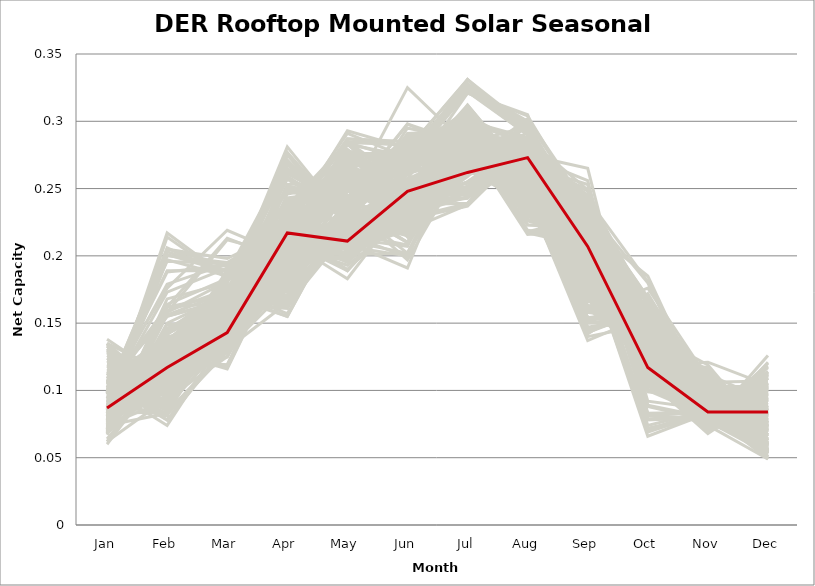
| Category | sample_001 | sample_002 | sample_003 | sample_004 | sample_005 | sample_006 | sample_007 | sample_008 | sample_009 | sample_010 | sample_011 | sample_012 | sample_013 | sample_014 | sample_015 | sample_016 | sample_017 | sample_018 | sample_019 | sample_020 | sample_021 | sample_022 | sample_023 | sample_024 | sample_025 | sample_026 | sample_027 | sample_028 | sample_029 | sample_030 | sample_031 | sample_032 | sample_033 | sample_034 | sample_035 | sample_036 | sample_037 | sample_038 | sample_039 | sample_040 | sample_041 | sample_042 | sample_043 | sample_044 | sample_045 | sample_046 | sample_047 | sample_048 | sample_049 | sample_050 | sample_051 | sample_052 | sample_053 | sample_054 | sample_055 | sample_056 | sample_057 | sample_058 | sample_059 | sample_060 | sample_061 | sample_062 | sample_063 | sample_064 | sample_065 | sample_066 | sample_067 | sample_068 | sample_069 | sample_070 | sample_071 | sample_072 | sample_073 | sample_074 | sample_075 | sample_076 | sample_077 | sample_078 | sample_079 | sample_080 | sample_081 | sample_082 | sample_083 | sample_084 | sample_085 | sample_086 | sample_087 | sample_088 | sample_089 | sample_090 | sample_091 | sample_092 | sample_093 | sample_094 | sample_095 | sample_096 | sample_097 | sample_098 | sample_099 | sample_100 | sample_101 | sample_102 | sample_103 | sample_104 | sample_105 | sample_106 | sample_107 | sample_108 | sample_109 | sample_110 | sample_111 | sample_112 | sample_113 | sample_114 | sample_115 | sample_116 | sample_117 | sample_118 | sample_119 | sample_120 | sample_121 | sample_122 | sample_123 | sample_124 | sample_125 | sample_126 | sample_127 | sample_128 | sample_129 | sample_130 | sample_131 | sample_132 | sample_133 | sample_134 | sample_135 | sample_136 | sample_137 | sample_138 | sample_139 | sample_140 | sample_141 | sample_142 | sample_143 | sample_144 | sample_145 | sample_146 | sample_147 | sample_148 | sample_149 | sample_150 | sample_151 | sample_152 | sample_153 | sample_154 | sample_155 | sample_156 | sample_157 | sample_158 | sample_159 | sample_160 | sample_161 | sample_162 | sample_163 | sample_164 | sample_165 | sample_166 | sample_167 | sample_168 | sample_169 | sample_170 | sample_171 | sample_172 | sample_173 | sample_174 | sample_175 | sample_176 | sample_178 | sample_179 | sample_180 | sample_181 | sample_182 | sample_183 | sample_184 | sample_185 | sample_186 | sample_187 | sample_188 | sample_189 | sample_190 | sample_191 | sample_192 | sample_193 | sample_194 | sample_195 | sample_196 | sample_197 | sample_198 | sample_199 | sample_200 | sample_201 | sample_202 | sample_203 | sample_204 | sample_205 | sample_206 | sample_207 | sample_208 | sample_209 | sample_210 | sample_211 | sample_212 | sample_213 | sample_214 | sample_215 | sample_216 | sample_217 | sample_218 | sample_219 | sample_220 | sample_221 | sample_222 | sample_223 | sample_224 | sample_225 | sample_226 | sample_227 | sample_228 | sample_229 | sample_230 | sample_231 | sample_232 | sample_233 | sample_234 | sample_235 | sample_236 | sample_237 | sample_238 | sample_239 | sample_240 | sample_241 | sample_242 | sample_243 | sample_244 | sample_245 | sample_246 | sample_247 | sample_248 | sample_249 | sample_250 | sample_177 |
|---|---|---|---|---|---|---|---|---|---|---|---|---|---|---|---|---|---|---|---|---|---|---|---|---|---|---|---|---|---|---|---|---|---|---|---|---|---|---|---|---|---|---|---|---|---|---|---|---|---|---|---|---|---|---|---|---|---|---|---|---|---|---|---|---|---|---|---|---|---|---|---|---|---|---|---|---|---|---|---|---|---|---|---|---|---|---|---|---|---|---|---|---|---|---|---|---|---|---|---|---|---|---|---|---|---|---|---|---|---|---|---|---|---|---|---|---|---|---|---|---|---|---|---|---|---|---|---|---|---|---|---|---|---|---|---|---|---|---|---|---|---|---|---|---|---|---|---|---|---|---|---|---|---|---|---|---|---|---|---|---|---|---|---|---|---|---|---|---|---|---|---|---|---|---|---|---|---|---|---|---|---|---|---|---|---|---|---|---|---|---|---|---|---|---|---|---|---|---|---|---|---|---|---|---|---|---|---|---|---|---|---|---|---|---|---|---|---|---|---|---|---|---|---|---|---|---|---|---|---|---|---|---|---|---|---|---|---|---|---|---|---|---|---|---|---|---|---|---|---|---|
| Jan | 0.106 | 0.072 | 0.075 | 0.102 | 0.108 | 0.084 | 0.083 | 0.131 | 0.114 | 0.105 | 0.073 | 0.082 | 0.099 | 0.076 | 0.122 | 0.085 | 0.104 | 0.109 | 0.122 | 0.072 | 0.083 | 0.085 | 0.085 | 0.105 | 0.104 | 0.094 | 0.091 | 0.115 | 0.085 | 0.075 | 0.085 | 0.079 | 0.096 | 0.083 | 0.076 | 0.078 | 0.077 | 0.087 | 0.099 | 0.138 | 0.09 | 0.118 | 0.105 | 0.078 | 0.068 | 0.086 | 0.124 | 0.134 | 0.109 | 0.089 | 0.084 | 0.083 | 0.092 | 0.113 | 0.098 | 0.135 | 0.128 | 0.073 | 0.113 | 0.074 | 0.105 | 0.098 | 0.079 | 0.067 | 0.091 | 0.078 | 0.101 | 0.085 | 0.099 | 0.111 | 0.087 | 0.086 | 0.095 | 0.107 | 0.084 | 0.069 | 0.107 | 0.11 | 0.113 | 0.082 | 0.115 | 0.108 | 0.098 | 0.133 | 0.093 | 0.119 | 0.113 | 0.105 | 0.085 | 0.086 | 0.091 | 0.078 | 0.084 | 0.083 | 0.112 | 0.069 | 0.119 | 0.109 | 0.119 | 0.078 | 0.108 | 0.064 | 0.07 | 0.081 | 0.095 | 0.09 | 0.088 | 0.079 | 0.089 | 0.131 | 0.097 | 0.118 | 0.129 | 0.135 | 0.103 | 0.087 | 0.073 | 0.088 | 0.084 | 0.077 | 0.071 | 0.083 | 0.081 | 0.069 | 0.081 | 0.083 | 0.111 | 0.082 | 0.086 | 0.085 | 0.126 | 0.107 | 0.068 | 0.106 | 0.095 | 0.062 | 0.079 | 0.074 | 0.087 | 0.089 | 0.079 | 0.101 | 0.092 | 0.13 | 0.097 | 0.091 | 0.094 | 0.084 | 0.071 | 0.099 | 0.087 | 0.078 | 0.07 | 0.097 | 0.112 | 0.06 | 0.118 | 0.12 | 0.092 | 0.08 | 0.099 | 0.135 | 0.098 | 0.111 | 0.096 | 0.089 | 0.095 | 0.084 | 0.086 | 0.114 | 0.105 | 0.08 | 0.082 | 0.086 | 0.079 | 0.109 | 0.074 | 0.084 | 0.087 | 0.082 | 0.092 | 0.078 | 0.077 | 0.101 | 0.088 | 0.088 | 0.108 | 0.092 | 0.101 | 0.108 | 0.102 | 0.072 | 0.083 | 0.098 | 0.083 | 0.088 | 0.079 | 0.1 | 0.098 | 0.093 | 0.102 | 0.096 | 0.082 | 0.086 | 0.112 | 0.081 | 0.1 | 0.106 | 0.116 | 0.105 | 0.08 | 0.106 | 0.089 | 0.088 | 0.102 | 0.087 | 0.106 | 0.094 | 0.101 | 0.077 | 0.109 | 0.099 | 0.094 | 0.104 | 0.112 | 0.077 | 0.091 | 0.107 | 0.106 | 0.062 | 0.111 | 0.106 | 0.068 | 0.088 | 0.108 | 0.093 | 0.111 | 0.09 | 0.124 | 0.133 | 0.077 | 0.083 | 0.081 | 0.111 | 0.093 | 0.114 | 0.091 | 0.077 | 0.071 | 0.087 |
| Feb | 0.121 | 0.115 | 0.159 | 0.114 | 0.117 | 0.108 | 0.121 | 0.101 | 0.086 | 0.102 | 0.135 | 0.116 | 0.113 | 0.164 | 0.106 | 0.137 | 0.078 | 0.131 | 0.106 | 0.143 | 0.106 | 0.118 | 0.146 | 0.129 | 0.127 | 0.173 | 0.11 | 0.106 | 0.142 | 0.142 | 0.106 | 0.095 | 0.123 | 0.124 | 0.114 | 0.121 | 0.13 | 0.135 | 0.162 | 0.108 | 0.122 | 0.108 | 0.115 | 0.206 | 0.156 | 0.116 | 0.098 | 0.097 | 0.131 | 0.109 | 0.122 | 0.112 | 0.089 | 0.111 | 0.189 | 0.097 | 0.094 | 0.135 | 0.098 | 0.093 | 0.155 | 0.2 | 0.127 | 0.146 | 0.081 | 0.127 | 0.087 | 0.203 | 0.205 | 0.117 | 0.122 | 0.099 | 0.119 | 0.139 | 0.108 | 0.142 | 0.128 | 0.106 | 0.09 | 0.104 | 0.116 | 0.109 | 0.118 | 0.096 | 0.09 | 0.102 | 0.118 | 0.11 | 0.104 | 0.108 | 0.112 | 0.121 | 0.128 | 0.133 | 0.107 | 0.138 | 0.108 | 0.126 | 0.122 | 0.115 | 0.092 | 0.118 | 0.15 | 0.101 | 0.108 | 0.111 | 0.125 | 0.118 | 0.134 | 0.098 | 0.094 | 0.103 | 0.106 | 0.094 | 0.12 | 0.099 | 0.1 | 0.117 | 0.101 | 0.123 | 0.144 | 0.123 | 0.214 | 0.112 | 0.131 | 0.131 | 0.124 | 0.118 | 0.126 | 0.104 | 0.103 | 0.127 | 0.108 | 0.123 | 0.118 | 0.094 | 0.123 | 0.083 | 0.108 | 0.122 | 0.117 | 0.158 | 0.124 | 0.088 | 0.117 | 0.119 | 0.122 | 0.114 | 0.168 | 0.112 | 0.142 | 0.129 | 0.162 | 0.179 | 0.121 | 0.119 | 0.117 | 0.115 | 0.123 | 0.127 | 0.196 | 0.113 | 0.118 | 0.133 | 0.093 | 0.144 | 0.094 | 0.144 | 0.122 | 0.113 | 0.134 | 0.107 | 0.101 | 0.092 | 0.099 | 0.14 | 0.143 | 0.106 | 0.116 | 0.128 | 0.102 | 0.115 | 0.118 | 0.12 | 0.115 | 0.099 | 0.123 | 0.127 | 0.083 | 0.082 | 0.074 | 0.135 | 0.084 | 0.188 | 0.134 | 0.201 | 0.132 | 0.106 | 0.11 | 0.097 | 0.162 | 0.092 | 0.107 | 0.217 | 0.119 | 0.109 | 0.134 | 0.122 | 0.096 | 0.115 | 0.12 | 0.085 | 0.107 | 0.12 | 0.176 | 0.095 | 0.155 | 0.119 | 0.082 | 0.158 | 0.138 | 0.205 | 0.129 | 0.137 | 0.117 | 0.125 | 0.112 | 0.115 | 0.085 | 0.124 | 0.113 | 0.123 | 0.149 | 0.11 | 0.078 | 0.115 | 0.12 | 0.098 | 0.104 | 0.097 | 0.123 | 0.197 | 0.106 | 0.131 | 0.121 | 0.115 | 0.118 | 0.115 | 0.142 | 0.117 |
| Mar | 0.153 | 0.187 | 0.175 | 0.158 | 0.169 | 0.146 | 0.171 | 0.13 | 0.157 | 0.143 | 0.171 | 0.171 | 0.156 | 0.183 | 0.134 | 0.175 | 0.133 | 0.166 | 0.135 | 0.166 | 0.169 | 0.171 | 0.17 | 0.116 | 0.117 | 0.191 | 0.148 | 0.156 | 0.165 | 0.174 | 0.149 | 0.151 | 0.189 | 0.154 | 0.185 | 0.171 | 0.172 | 0.163 | 0.213 | 0.156 | 0.144 | 0.153 | 0.151 | 0.185 | 0.173 | 0.168 | 0.134 | 0.148 | 0.145 | 0.173 | 0.175 | 0.17 | 0.155 | 0.172 | 0.189 | 0.148 | 0.152 | 0.16 | 0.15 | 0.142 | 0.168 | 0.195 | 0.174 | 0.149 | 0.182 | 0.149 | 0.15 | 0.189 | 0.198 | 0.172 | 0.152 | 0.182 | 0.143 | 0.151 | 0.162 | 0.17 | 0.145 | 0.148 | 0.162 | 0.147 | 0.119 | 0.156 | 0.166 | 0.133 | 0.151 | 0.151 | 0.14 | 0.163 | 0.155 | 0.142 | 0.137 | 0.176 | 0.174 | 0.176 | 0.164 | 0.152 | 0.128 | 0.145 | 0.167 | 0.168 | 0.149 | 0.132 | 0.171 | 0.142 | 0.152 | 0.152 | 0.162 | 0.185 | 0.178 | 0.148 | 0.169 | 0.134 | 0.148 | 0.136 | 0.161 | 0.161 | 0.138 | 0.144 | 0.14 | 0.149 | 0.177 | 0.171 | 0.183 | 0.187 | 0.174 | 0.173 | 0.153 | 0.168 | 0.151 | 0.16 | 0.138 | 0.14 | 0.13 | 0.125 | 0.147 | 0.125 | 0.171 | 0.131 | 0.15 | 0.167 | 0.181 | 0.212 | 0.141 | 0.137 | 0.158 | 0.162 | 0.143 | 0.155 | 0.18 | 0.17 | 0.169 | 0.17 | 0.171 | 0.194 | 0.125 | 0.133 | 0.174 | 0.15 | 0.143 | 0.14 | 0.194 | 0.155 | 0.153 | 0.171 | 0.149 | 0.165 | 0.152 | 0.169 | 0.166 | 0.136 | 0.146 | 0.167 | 0.167 | 0.149 | 0.156 | 0.148 | 0.169 | 0.169 | 0.165 | 0.17 | 0.156 | 0.182 | 0.151 | 0.171 | 0.145 | 0.157 | 0.161 | 0.142 | 0.154 | 0.129 | 0.142 | 0.162 | 0.131 | 0.193 | 0.171 | 0.188 | 0.175 | 0.172 | 0.162 | 0.152 | 0.165 | 0.146 | 0.143 | 0.184 | 0.151 | 0.154 | 0.162 | 0.119 | 0.158 | 0.159 | 0.183 | 0.155 | 0.166 | 0.14 | 0.219 | 0.15 | 0.167 | 0.175 | 0.169 | 0.181 | 0.166 | 0.193 | 0.139 | 0.167 | 0.156 | 0.149 | 0.14 | 0.175 | 0.158 | 0.135 | 0.149 | 0.146 | 0.149 | 0.147 | 0.134 | 0.144 | 0.167 | 0.15 | 0.138 | 0.138 | 0.156 | 0.185 | 0.138 | 0.151 | 0.164 | 0.133 | 0.146 | 0.181 | 0.175 | 0.143 |
| Apr | 0.237 | 0.27 | 0.238 | 0.232 | 0.216 | 0.222 | 0.163 | 0.209 | 0.187 | 0.175 | 0.223 | 0.176 | 0.235 | 0.249 | 0.211 | 0.183 | 0.185 | 0.221 | 0.204 | 0.214 | 0.257 | 0.162 | 0.188 | 0.208 | 0.208 | 0.218 | 0.192 | 0.202 | 0.184 | 0.224 | 0.253 | 0.215 | 0.202 | 0.213 | 0.262 | 0.181 | 0.178 | 0.184 | 0.196 | 0.204 | 0.189 | 0.218 | 0.237 | 0.224 | 0.243 | 0.163 | 0.207 | 0.207 | 0.184 | 0.281 | 0.164 | 0.168 | 0.218 | 0.203 | 0.224 | 0.214 | 0.213 | 0.216 | 0.212 | 0.209 | 0.231 | 0.222 | 0.169 | 0.202 | 0.199 | 0.195 | 0.171 | 0.231 | 0.22 | 0.202 | 0.22 | 0.23 | 0.188 | 0.183 | 0.275 | 0.233 | 0.179 | 0.223 | 0.197 | 0.246 | 0.21 | 0.204 | 0.224 | 0.21 | 0.218 | 0.206 | 0.177 | 0.226 | 0.211 | 0.219 | 0.192 | 0.177 | 0.186 | 0.173 | 0.215 | 0.208 | 0.197 | 0.187 | 0.22 | 0.271 | 0.174 | 0.184 | 0.228 | 0.217 | 0.188 | 0.186 | 0.162 | 0.268 | 0.201 | 0.211 | 0.186 | 0.202 | 0.21 | 0.208 | 0.225 | 0.258 | 0.211 | 0.183 | 0.224 | 0.203 | 0.223 | 0.265 | 0.225 | 0.262 | 0.185 | 0.18 | 0.219 | 0.277 | 0.216 | 0.219 | 0.205 | 0.189 | 0.192 | 0.213 | 0.193 | 0.2 | 0.166 | 0.176 | 0.229 | 0.216 | 0.261 | 0.2 | 0.194 | 0.206 | 0.234 | 0.197 | 0.208 | 0.202 | 0.25 | 0.155 | 0.186 | 0.171 | 0.251 | 0.212 | 0.205 | 0.19 | 0.242 | 0.214 | 0.206 | 0.228 | 0.214 | 0.196 | 0.234 | 0.204 | 0.22 | 0.184 | 0.224 | 0.177 | 0.182 | 0.198 | 0.185 | 0.271 | 0.259 | 0.223 | 0.23 | 0.193 | 0.24 | 0.268 | 0.27 | 0.169 | 0.264 | 0.268 | 0.201 | 0.239 | 0.192 | 0.217 | 0.22 | 0.195 | 0.218 | 0.183 | 0.191 | 0.221 | 0.165 | 0.226 | 0.17 | 0.221 | 0.186 | 0.155 | 0.225 | 0.261 | 0.229 | 0.221 | 0.219 | 0.23 | 0.216 | 0.205 | 0.224 | 0.208 | 0.189 | 0.233 | 0.268 | 0.189 | 0.252 | 0.197 | 0.2 | 0.207 | 0.228 | 0.157 | 0.188 | 0.248 | 0.211 | 0.218 | 0.189 | 0.211 | 0.213 | 0.198 | 0.218 | 0.21 | 0.194 | 0.183 | 0.181 | 0.177 | 0.213 | 0.183 | 0.187 | 0.192 | 0.208 | 0.252 | 0.214 | 0.211 | 0.206 | 0.226 | 0.222 | 0.19 | 0.161 | 0.201 | 0.198 | 0.263 | 0.227 | 0.217 |
| May | 0.225 | 0.232 | 0.243 | 0.283 | 0.19 | 0.219 | 0.218 | 0.277 | 0.21 | 0.235 | 0.261 | 0.217 | 0.276 | 0.24 | 0.269 | 0.218 | 0.25 | 0.293 | 0.262 | 0.251 | 0.229 | 0.227 | 0.223 | 0.258 | 0.251 | 0.213 | 0.229 | 0.201 | 0.222 | 0.256 | 0.255 | 0.262 | 0.245 | 0.26 | 0.235 | 0.222 | 0.224 | 0.229 | 0.2 | 0.274 | 0.225 | 0.206 | 0.284 | 0.219 | 0.249 | 0.231 | 0.263 | 0.285 | 0.239 | 0.226 | 0.226 | 0.23 | 0.259 | 0.202 | 0.204 | 0.277 | 0.283 | 0.267 | 0.213 | 0.255 | 0.262 | 0.21 | 0.226 | 0.278 | 0.224 | 0.252 | 0.222 | 0.21 | 0.212 | 0.197 | 0.273 | 0.207 | 0.23 | 0.248 | 0.223 | 0.258 | 0.233 | 0.204 | 0.216 | 0.254 | 0.252 | 0.217 | 0.278 | 0.274 | 0.261 | 0.211 | 0.235 | 0.291 | 0.256 | 0.259 | 0.223 | 0.217 | 0.222 | 0.222 | 0.195 | 0.269 | 0.259 | 0.255 | 0.189 | 0.222 | 0.233 | 0.238 | 0.251 | 0.26 | 0.222 | 0.22 | 0.24 | 0.242 | 0.248 | 0.279 | 0.231 | 0.271 | 0.274 | 0.283 | 0.287 | 0.235 | 0.25 | 0.226 | 0.264 | 0.252 | 0.256 | 0.232 | 0.206 | 0.235 | 0.226 | 0.221 | 0.206 | 0.226 | 0.272 | 0.267 | 0.263 | 0.237 | 0.236 | 0.25 | 0.229 | 0.231 | 0.221 | 0.236 | 0.254 | 0.271 | 0.238 | 0.198 | 0.224 | 0.269 | 0.27 | 0.257 | 0.224 | 0.261 | 0.234 | 0.237 | 0.225 | 0.214 | 0.241 | 0.215 | 0.256 | 0.239 | 0.241 | 0.209 | 0.223 | 0.227 | 0.211 | 0.277 | 0.267 | 0.198 | 0.266 | 0.227 | 0.261 | 0.231 | 0.23 | 0.262 | 0.248 | 0.229 | 0.231 | 0.262 | 0.241 | 0.258 | 0.243 | 0.229 | 0.224 | 0.227 | 0.234 | 0.238 | 0.257 | 0.252 | 0.216 | 0.264 | 0.287 | 0.226 | 0.253 | 0.25 | 0.239 | 0.26 | 0.228 | 0.212 | 0.22 | 0.205 | 0.216 | 0.237 | 0.238 | 0.239 | 0.255 | 0.264 | 0.224 | 0.204 | 0.202 | 0.258 | 0.285 | 0.253 | 0.207 | 0.284 | 0.231 | 0.239 | 0.23 | 0.22 | 0.207 | 0.258 | 0.257 | 0.235 | 0.234 | 0.238 | 0.183 | 0.209 | 0.224 | 0.189 | 0.201 | 0.248 | 0.213 | 0.2 | 0.232 | 0.237 | 0.24 | 0.234 | 0.274 | 0.216 | 0.24 | 0.225 | 0.193 | 0.243 | 0.278 | 0.279 | 0.254 | 0.21 | 0.262 | 0.266 | 0.236 | 0.258 | 0.218 | 0.235 | 0.254 | 0.211 |
| Jun | 0.255 | 0.275 | 0.288 | 0.274 | 0.232 | 0.24 | 0.23 | 0.253 | 0.191 | 0.267 | 0.263 | 0.225 | 0.276 | 0.287 | 0.242 | 0.233 | 0.232 | 0.28 | 0.252 | 0.269 | 0.28 | 0.218 | 0.249 | 0.248 | 0.256 | 0.222 | 0.243 | 0.202 | 0.24 | 0.282 | 0.252 | 0.218 | 0.253 | 0.278 | 0.271 | 0.227 | 0.24 | 0.244 | 0.236 | 0.275 | 0.239 | 0.22 | 0.271 | 0.249 | 0.289 | 0.227 | 0.244 | 0.253 | 0.279 | 0.282 | 0.215 | 0.228 | 0.229 | 0.231 | 0.23 | 0.257 | 0.242 | 0.238 | 0.207 | 0.217 | 0.263 | 0.243 | 0.242 | 0.226 | 0.246 | 0.277 | 0.257 | 0.248 | 0.232 | 0.233 | 0.28 | 0.264 | 0.239 | 0.268 | 0.282 | 0.278 | 0.27 | 0.219 | 0.199 | 0.252 | 0.257 | 0.208 | 0.269 | 0.248 | 0.229 | 0.202 | 0.273 | 0.273 | 0.266 | 0.224 | 0.23 | 0.224 | 0.232 | 0.24 | 0.235 | 0.229 | 0.252 | 0.273 | 0.239 | 0.288 | 0.269 | 0.277 | 0.285 | 0.214 | 0.227 | 0.238 | 0.21 | 0.276 | 0.242 | 0.24 | 0.224 | 0.251 | 0.261 | 0.255 | 0.285 | 0.282 | 0.223 | 0.239 | 0.219 | 0.279 | 0.286 | 0.28 | 0.24 | 0.277 | 0.234 | 0.235 | 0.233 | 0.295 | 0.28 | 0.267 | 0.242 | 0.279 | 0.27 | 0.248 | 0.247 | 0.277 | 0.229 | 0.285 | 0.257 | 0.251 | 0.276 | 0.229 | 0.231 | 0.234 | 0.278 | 0.274 | 0.232 | 0.273 | 0.283 | 0.202 | 0.237 | 0.23 | 0.298 | 0.225 | 0.251 | 0.276 | 0.325 | 0.222 | 0.238 | 0.256 | 0.237 | 0.269 | 0.278 | 0.239 | 0.228 | 0.245 | 0.222 | 0.236 | 0.228 | 0.243 | 0.277 | 0.291 | 0.276 | 0.222 | 0.256 | 0.278 | 0.298 | 0.275 | 0.29 | 0.242 | 0.268 | 0.275 | 0.281 | 0.264 | 0.23 | 0.224 | 0.282 | 0.242 | 0.239 | 0.24 | 0.231 | 0.261 | 0.268 | 0.233 | 0.241 | 0.245 | 0.237 | 0.197 | 0.279 | 0.275 | 0.251 | 0.222 | 0.244 | 0.262 | 0.222 | 0.269 | 0.282 | 0.235 | 0.2 | 0.283 | 0.283 | 0.23 | 0.282 | 0.235 | 0.227 | 0.217 | 0.252 | 0.21 | 0.234 | 0.28 | 0.241 | 0.233 | 0.233 | 0.237 | 0.239 | 0.28 | 0.249 | 0.241 | 0.229 | 0.266 | 0.272 | 0.27 | 0.242 | 0.235 | 0.225 | 0.228 | 0.228 | 0.26 | 0.254 | 0.248 | 0.278 | 0.244 | 0.22 | 0.274 | 0.21 | 0.261 | 0.219 | 0.267 | 0.273 | 0.248 |
| Jul | 0.273 | 0.281 | 0.28 | 0.285 | 0.281 | 0.248 | 0.284 | 0.284 | 0.3 | 0.323 | 0.285 | 0.276 | 0.297 | 0.291 | 0.273 | 0.298 | 0.287 | 0.285 | 0.286 | 0.291 | 0.289 | 0.289 | 0.302 | 0.276 | 0.278 | 0.274 | 0.243 | 0.284 | 0.293 | 0.277 | 0.291 | 0.27 | 0.27 | 0.308 | 0.29 | 0.276 | 0.294 | 0.297 | 0.262 | 0.272 | 0.248 | 0.284 | 0.287 | 0.309 | 0.275 | 0.29 | 0.277 | 0.283 | 0.331 | 0.289 | 0.283 | 0.287 | 0.274 | 0.269 | 0.301 | 0.271 | 0.276 | 0.292 | 0.29 | 0.261 | 0.273 | 0.297 | 0.282 | 0.3 | 0.286 | 0.3 | 0.321 | 0.312 | 0.298 | 0.274 | 0.303 | 0.288 | 0.255 | 0.322 | 0.279 | 0.279 | 0.331 | 0.271 | 0.298 | 0.285 | 0.269 | 0.295 | 0.281 | 0.279 | 0.277 | 0.291 | 0.322 | 0.285 | 0.3 | 0.27 | 0.244 | 0.28 | 0.29 | 0.295 | 0.268 | 0.293 | 0.28 | 0.323 | 0.29 | 0.29 | 0.324 | 0.292 | 0.29 | 0.266 | 0.237 | 0.239 | 0.279 | 0.289 | 0.285 | 0.272 | 0.307 | 0.276 | 0.274 | 0.285 | 0.29 | 0.292 | 0.26 | 0.243 | 0.268 | 0.302 | 0.283 | 0.296 | 0.306 | 0.286 | 0.28 | 0.304 | 0.28 | 0.285 | 0.306 | 0.298 | 0.276 | 0.331 | 0.283 | 0.28 | 0.245 | 0.284 | 0.283 | 0.277 | 0.278 | 0.293 | 0.293 | 0.261 | 0.248 | 0.274 | 0.296 | 0.269 | 0.252 | 0.303 | 0.28 | 0.273 | 0.301 | 0.288 | 0.278 | 0.272 | 0.272 | 0.285 | 0.282 | 0.285 | 0.255 | 0.246 | 0.3 | 0.264 | 0.296 | 0.282 | 0.286 | 0.3 | 0.278 | 0.305 | 0.3 | 0.272 | 0.326 | 0.293 | 0.283 | 0.273 | 0.27 | 0.323 | 0.283 | 0.281 | 0.288 | 0.289 | 0.286 | 0.288 | 0.297 | 0.29 | 0.247 | 0.281 | 0.287 | 0.251 | 0.279 | 0.282 | 0.291 | 0.299 | 0.283 | 0.304 | 0.292 | 0.301 | 0.298 | 0.274 | 0.289 | 0.295 | 0.262 | 0.279 | 0.254 | 0.312 | 0.279 | 0.305 | 0.291 | 0.266 | 0.295 | 0.298 | 0.294 | 0.309 | 0.289 | 0.25 | 0.259 | 0.276 | 0.272 | 0.285 | 0.303 | 0.291 | 0.293 | 0.298 | 0.255 | 0.286 | 0.277 | 0.298 | 0.251 | 0.28 | 0.307 | 0.276 | 0.322 | 0.328 | 0.304 | 0.243 | 0.285 | 0.239 | 0.275 | 0.294 | 0.286 | 0.287 | 0.303 | 0.308 | 0.272 | 0.321 | 0.272 | 0.277 | 0.238 | 0.285 | 0.275 | 0.262 |
| Aug | 0.272 | 0.243 | 0.282 | 0.218 | 0.23 | 0.269 | 0.253 | 0.259 | 0.244 | 0.29 | 0.28 | 0.255 | 0.227 | 0.278 | 0.26 | 0.245 | 0.273 | 0.218 | 0.26 | 0.283 | 0.251 | 0.261 | 0.241 | 0.254 | 0.255 | 0.296 | 0.282 | 0.236 | 0.238 | 0.282 | 0.27 | 0.269 | 0.251 | 0.249 | 0.243 | 0.256 | 0.253 | 0.24 | 0.298 | 0.243 | 0.287 | 0.243 | 0.217 | 0.26 | 0.285 | 0.259 | 0.257 | 0.247 | 0.296 | 0.241 | 0.262 | 0.258 | 0.274 | 0.236 | 0.268 | 0.241 | 0.242 | 0.28 | 0.246 | 0.274 | 0.266 | 0.277 | 0.249 | 0.288 | 0.272 | 0.253 | 0.304 | 0.259 | 0.275 | 0.237 | 0.24 | 0.252 | 0.287 | 0.295 | 0.245 | 0.279 | 0.29 | 0.237 | 0.248 | 0.27 | 0.252 | 0.247 | 0.223 | 0.254 | 0.278 | 0.238 | 0.293 | 0.216 | 0.247 | 0.275 | 0.268 | 0.254 | 0.252 | 0.252 | 0.234 | 0.282 | 0.253 | 0.297 | 0.23 | 0.244 | 0.3 | 0.284 | 0.283 | 0.274 | 0.281 | 0.284 | 0.274 | 0.237 | 0.258 | 0.238 | 0.25 | 0.262 | 0.241 | 0.253 | 0.223 | 0.256 | 0.275 | 0.288 | 0.267 | 0.255 | 0.282 | 0.245 | 0.256 | 0.249 | 0.251 | 0.25 | 0.242 | 0.254 | 0.241 | 0.241 | 0.257 | 0.291 | 0.27 | 0.253 | 0.286 | 0.296 | 0.258 | 0.287 | 0.277 | 0.234 | 0.241 | 0.297 | 0.284 | 0.253 | 0.231 | 0.302 | 0.271 | 0.252 | 0.275 | 0.271 | 0.249 | 0.259 | 0.28 | 0.297 | 0.256 | 0.284 | 0.288 | 0.237 | 0.274 | 0.28 | 0.283 | 0.238 | 0.229 | 0.237 | 0.278 | 0.241 | 0.279 | 0.245 | 0.245 | 0.258 | 0.3 | 0.244 | 0.25 | 0.27 | 0.284 | 0.299 | 0.281 | 0.246 | 0.252 | 0.253 | 0.252 | 0.241 | 0.252 | 0.272 | 0.27 | 0.279 | 0.219 | 0.282 | 0.278 | 0.28 | 0.265 | 0.284 | 0.28 | 0.269 | 0.252 | 0.257 | 0.245 | 0.27 | 0.286 | 0.257 | 0.258 | 0.279 | 0.272 | 0.258 | 0.238 | 0.253 | 0.227 | 0.246 | 0.243 | 0.226 | 0.242 | 0.256 | 0.253 | 0.281 | 0.297 | 0.276 | 0.268 | 0.258 | 0.251 | 0.276 | 0.237 | 0.274 | 0.283 | 0.235 | 0.239 | 0.251 | 0.275 | 0.244 | 0.25 | 0.291 | 0.29 | 0.293 | 0.281 | 0.275 | 0.274 | 0.287 | 0.233 | 0.264 | 0.255 | 0.25 | 0.247 | 0.261 | 0.276 | 0.305 | 0.272 | 0.249 | 0.282 | 0.239 | 0.28 | 0.273 |
| Sep | 0.19 | 0.184 | 0.217 | 0.222 | 0.21 | 0.186 | 0.142 | 0.194 | 0.233 | 0.239 | 0.242 | 0.145 | 0.216 | 0.213 | 0.2 | 0.137 | 0.203 | 0.229 | 0.196 | 0.224 | 0.194 | 0.161 | 0.15 | 0.22 | 0.226 | 0.224 | 0.207 | 0.235 | 0.154 | 0.235 | 0.196 | 0.249 | 0.215 | 0.228 | 0.187 | 0.146 | 0.144 | 0.152 | 0.223 | 0.174 | 0.203 | 0.232 | 0.207 | 0.194 | 0.227 | 0.159 | 0.199 | 0.181 | 0.208 | 0.177 | 0.159 | 0.153 | 0.204 | 0.217 | 0.202 | 0.178 | 0.179 | 0.234 | 0.231 | 0.256 | 0.186 | 0.212 | 0.16 | 0.221 | 0.161 | 0.228 | 0.23 | 0.206 | 0.211 | 0.218 | 0.224 | 0.179 | 0.208 | 0.191 | 0.169 | 0.231 | 0.218 | 0.237 | 0.236 | 0.197 | 0.218 | 0.237 | 0.223 | 0.19 | 0.198 | 0.227 | 0.225 | 0.219 | 0.228 | 0.223 | 0.225 | 0.154 | 0.146 | 0.162 | 0.226 | 0.234 | 0.21 | 0.199 | 0.203 | 0.178 | 0.234 | 0.222 | 0.235 | 0.248 | 0.218 | 0.222 | 0.166 | 0.188 | 0.211 | 0.176 | 0.193 | 0.202 | 0.184 | 0.183 | 0.219 | 0.188 | 0.265 | 0.214 | 0.253 | 0.23 | 0.233 | 0.188 | 0.195 | 0.187 | 0.16 | 0.143 | 0.243 | 0.184 | 0.228 | 0.23 | 0.197 | 0.225 | 0.229 | 0.217 | 0.208 | 0.227 | 0.16 | 0.249 | 0.186 | 0.217 | 0.187 | 0.221 | 0.208 | 0.185 | 0.222 | 0.236 | 0.203 | 0.227 | 0.213 | 0.16 | 0.147 | 0.153 | 0.226 | 0.226 | 0.213 | 0.227 | 0.191 | 0.241 | 0.208 | 0.172 | 0.204 | 0.167 | 0.23 | 0.218 | 0.214 | 0.16 | 0.218 | 0.146 | 0.14 | 0.203 | 0.2 | 0.183 | 0.19 | 0.214 | 0.189 | 0.187 | 0.223 | 0.182 | 0.17 | 0.154 | 0.192 | 0.19 | 0.223 | 0.215 | 0.233 | 0.212 | 0.211 | 0.207 | 0.196 | 0.212 | 0.199 | 0.234 | 0.245 | 0.208 | 0.158 | 0.209 | 0.143 | 0.163 | 0.202 | 0.195 | 0.183 | 0.209 | 0.193 | 0.184 | 0.237 | 0.234 | 0.226 | 0.215 | 0.235 | 0.214 | 0.185 | 0.194 | 0.191 | 0.215 | 0.21 | 0.244 | 0.179 | 0.154 | 0.188 | 0.204 | 0.203 | 0.215 | 0.207 | 0.213 | 0.238 | 0.231 | 0.207 | 0.223 | 0.195 | 0.213 | 0.234 | 0.219 | 0.242 | 0.218 | 0.208 | 0.2 | 0.208 | 0.199 | 0.188 | 0.184 | 0.224 | 0.199 | 0.239 | 0.181 | 0.158 | 0.216 | 0.199 | 0.185 | 0.226 | 0.207 |
| Oct | 0.128 | 0.109 | 0.148 | 0.115 | 0.136 | 0.113 | 0.172 | 0.13 | 0.144 | 0.129 | 0.149 | 0.156 | 0.125 | 0.137 | 0.118 | 0.156 | 0.129 | 0.1 | 0.124 | 0.167 | 0.131 | 0.161 | 0.151 | 0.124 | 0.12 | 0.125 | 0.129 | 0.155 | 0.148 | 0.158 | 0.131 | 0.083 | 0.133 | 0.149 | 0.114 | 0.154 | 0.165 | 0.146 | 0.136 | 0.13 | 0.125 | 0.144 | 0.123 | 0.101 | 0.143 | 0.164 | 0.116 | 0.137 | 0.123 | 0.12 | 0.162 | 0.164 | 0.072 | 0.134 | 0.11 | 0.128 | 0.119 | 0.169 | 0.148 | 0.088 | 0.108 | 0.128 | 0.16 | 0.185 | 0.125 | 0.164 | 0.143 | 0.104 | 0.12 | 0.129 | 0.131 | 0.109 | 0.125 | 0.127 | 0.133 | 0.153 | 0.115 | 0.139 | 0.141 | 0.135 | 0.119 | 0.15 | 0.108 | 0.13 | 0.066 | 0.149 | 0.116 | 0.109 | 0.142 | 0.082 | 0.124 | 0.16 | 0.157 | 0.158 | 0.132 | 0.18 | 0.122 | 0.128 | 0.134 | 0.129 | 0.142 | 0.165 | 0.157 | 0.081 | 0.119 | 0.127 | 0.17 | 0.114 | 0.131 | 0.127 | 0.133 | 0.122 | 0.132 | 0.133 | 0.114 | 0.137 | 0.089 | 0.126 | 0.079 | 0.157 | 0.159 | 0.119 | 0.103 | 0.107 | 0.144 | 0.16 | 0.143 | 0.136 | 0.135 | 0.125 | 0.116 | 0.118 | 0.159 | 0.119 | 0.126 | 0.148 | 0.166 | 0.147 | 0.145 | 0.126 | 0.121 | 0.135 | 0.125 | 0.126 | 0.133 | 0.14 | 0.108 | 0.15 | 0.126 | 0.167 | 0.155 | 0.167 | 0.147 | 0.123 | 0.119 | 0.158 | 0.144 | 0.156 | 0.113 | 0.122 | 0.126 | 0.133 | 0.132 | 0.148 | 0.071 | 0.153 | 0.07 | 0.156 | 0.149 | 0.114 | 0.125 | 0.131 | 0.129 | 0.074 | 0.142 | 0.135 | 0.145 | 0.128 | 0.132 | 0.155 | 0.13 | 0.117 | 0.157 | 0.118 | 0.133 | 0.078 | 0.116 | 0.122 | 0.07 | 0.135 | 0.123 | 0.169 | 0.163 | 0.117 | 0.152 | 0.099 | 0.162 | 0.166 | 0.142 | 0.138 | 0.108 | 0.069 | 0.119 | 0.109 | 0.156 | 0.147 | 0.117 | 0.121 | 0.154 | 0.124 | 0.12 | 0.122 | 0.132 | 0.116 | 0.132 | 0.092 | 0.109 | 0.155 | 0.132 | 0.118 | 0.146 | 0.135 | 0.123 | 0.144 | 0.134 | 0.165 | 0.116 | 0.13 | 0.128 | 0.158 | 0.11 | 0.118 | 0.181 | 0.122 | 0.133 | 0.122 | 0.13 | 0.128 | 0.13 | 0.132 | 0.15 | 0.105 | 0.082 | 0.141 | 0.176 | 0.13 | 0.117 | 0.11 | 0.153 | 0.117 |
| Nov | 0.102 | 0.071 | 0.08 | 0.077 | 0.085 | 0.079 | 0.099 | 0.098 | 0.095 | 0.111 | 0.083 | 0.1 | 0.072 | 0.085 | 0.103 | 0.091 | 0.101 | 0.081 | 0.108 | 0.08 | 0.092 | 0.102 | 0.092 | 0.111 | 0.115 | 0.089 | 0.099 | 0.083 | 0.094 | 0.076 | 0.093 | 0.084 | 0.081 | 0.078 | 0.076 | 0.098 | 0.095 | 0.098 | 0.096 | 0.086 | 0.098 | 0.079 | 0.075 | 0.084 | 0.077 | 0.103 | 0.104 | 0.093 | 0.098 | 0.083 | 0.102 | 0.099 | 0.082 | 0.085 | 0.092 | 0.085 | 0.091 | 0.084 | 0.081 | 0.078 | 0.069 | 0.088 | 0.096 | 0.089 | 0.1 | 0.079 | 0.119 | 0.084 | 0.084 | 0.081 | 0.08 | 0.107 | 0.097 | 0.086 | 0.082 | 0.075 | 0.099 | 0.078 | 0.095 | 0.093 | 0.107 | 0.091 | 0.083 | 0.101 | 0.083 | 0.083 | 0.102 | 0.079 | 0.078 | 0.083 | 0.108 | 0.097 | 0.087 | 0.098 | 0.085 | 0.09 | 0.113 | 0.088 | 0.084 | 0.083 | 0.115 | 0.093 | 0.088 | 0.078 | 0.104 | 0.105 | 0.108 | 0.079 | 0.08 | 0.09 | 0.092 | 0.105 | 0.085 | 0.095 | 0.082 | 0.087 | 0.08 | 0.11 | 0.078 | 0.08 | 0.077 | 0.083 | 0.083 | 0.073 | 0.097 | 0.093 | 0.077 | 0.081 | 0.079 | 0.08 | 0.102 | 0.102 | 0.097 | 0.114 | 0.098 | 0.108 | 0.102 | 0.107 | 0.102 | 0.075 | 0.075 | 0.093 | 0.099 | 0.099 | 0.074 | 0.112 | 0.09 | 0.083 | 0.083 | 0.107 | 0.097 | 0.099 | 0.08 | 0.086 | 0.105 | 0.094 | 0.092 | 0.081 | 0.091 | 0.082 | 0.087 | 0.087 | 0.078 | 0.077 | 0.084 | 0.093 | 0.082 | 0.09 | 0.096 | 0.105 | 0.096 | 0.088 | 0.094 | 0.085 | 0.101 | 0.078 | 0.081 | 0.089 | 0.08 | 0.1 | 0.089 | 0.077 | 0.079 | 0.121 | 0.11 | 0.08 | 0.082 | 0.097 | 0.087 | 0.096 | 0.103 | 0.092 | 0.102 | 0.084 | 0.097 | 0.094 | 0.092 | 0.107 | 0.106 | 0.087 | 0.068 | 0.084 | 0.082 | 0.081 | 0.076 | 0.083 | 0.081 | 0.117 | 0.098 | 0.077 | 0.08 | 0.104 | 0.096 | 0.095 | 0.084 | 0.086 | 0.074 | 0.103 | 0.1 | 0.086 | 0.089 | 0.083 | 0.098 | 0.074 | 0.084 | 0.082 | 0.091 | 0.082 | 0.099 | 0.1 | 0.107 | 0.101 | 0.085 | 0.105 | 0.099 | 0.094 | 0.088 | 0.095 | 0.099 | 0.096 | 0.08 | 0.086 | 0.078 | 0.074 | 0.109 | 0.111 | 0.095 | 0.076 | 0.075 | 0.084 |
| Dec | 0.084 | 0.104 | 0.078 | 0.11 | 0.051 | 0.081 | 0.083 | 0.056 | 0.063 | 0.063 | 0.084 | 0.087 | 0.121 | 0.073 | 0.051 | 0.101 | 0.102 | 0.109 | 0.053 | 0.077 | 0.074 | 0.084 | 0.098 | 0.054 | 0.06 | 0.092 | 0.08 | 0.06 | 0.096 | 0.085 | 0.073 | 0.057 | 0.078 | 0.113 | 0.097 | 0.085 | 0.102 | 0.098 | 0.098 | 0.061 | 0.077 | 0.061 | 0.111 | 0.095 | 0.075 | 0.082 | 0.053 | 0.061 | 0.074 | 0.077 | 0.087 | 0.083 | 0.085 | 0.056 | 0.092 | 0.058 | 0.061 | 0.076 | 0.06 | 0.064 | 0.102 | 0.097 | 0.097 | 0.078 | 0.085 | 0.094 | 0.066 | 0.091 | 0.094 | 0.058 | 0.117 | 0.086 | 0.073 | 0.076 | 0.075 | 0.083 | 0.067 | 0.062 | 0.064 | 0.072 | 0.054 | 0.066 | 0.103 | 0.055 | 0.08 | 0.06 | 0.07 | 0.105 | 0.118 | 0.06 | 0.085 | 0.093 | 0.105 | 0.098 | 0.056 | 0.076 | 0.055 | 0.074 | 0.049 | 0.078 | 0.067 | 0.074 | 0.079 | 0.06 | 0.083 | 0.081 | 0.082 | 0.096 | 0.087 | 0.058 | 0.091 | 0.056 | 0.059 | 0.059 | 0.104 | 0.082 | 0.063 | 0.081 | 0.055 | 0.101 | 0.087 | 0.081 | 0.091 | 0.102 | 0.1 | 0.097 | 0.055 | 0.081 | 0.12 | 0.114 | 0.054 | 0.073 | 0.071 | 0.063 | 0.078 | 0.081 | 0.085 | 0.093 | 0.075 | 0.126 | 0.093 | 0.1 | 0.076 | 0.055 | 0.113 | 0.092 | 0.077 | 0.112 | 0.073 | 0.087 | 0.094 | 0.086 | 0.074 | 0.095 | 0.056 | 0.074 | 0.072 | 0.055 | 0.078 | 0.073 | 0.088 | 0.064 | 0.112 | 0.053 | 0.079 | 0.092 | 0.079 | 0.098 | 0.094 | 0.055 | 0.069 | 0.076 | 0.072 | 0.07 | 0.07 | 0.08 | 0.071 | 0.075 | 0.076 | 0.099 | 0.076 | 0.093 | 0.1 | 0.104 | 0.087 | 0.074 | 0.106 | 0.078 | 0.073 | 0.1 | 0.103 | 0.072 | 0.102 | 0.093 | 0.094 | 0.091 | 0.099 | 0.086 | 0.107 | 0.078 | 0.098 | 0.078 | 0.084 | 0.089 | 0.058 | 0.114 | 0.101 | 0.056 | 0.07 | 0.109 | 0.093 | 0.096 | 0.073 | 0.076 | 0.105 | 0.056 | 0.103 | 0.088 | 0.089 | 0.069 | 0.049 | 0.091 | 0.076 | 0.049 | 0.057 | 0.099 | 0.082 | 0.06 | 0.091 | 0.075 | 0.076 | 0.071 | 0.076 | 0.083 | 0.097 | 0.08 | 0.05 | 0.073 | 0.059 | 0.056 | 0.109 | 0.09 | 0.062 | 0.078 | 0.085 | 0.054 | 0.069 | 0.095 | 0.083 | 0.084 |